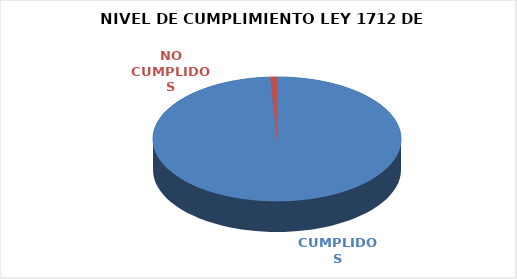
| Category | Series 0 |
|---|---|
| CUMPLIDOS | 113 |
| NO CUMPLIDOS | 1 |